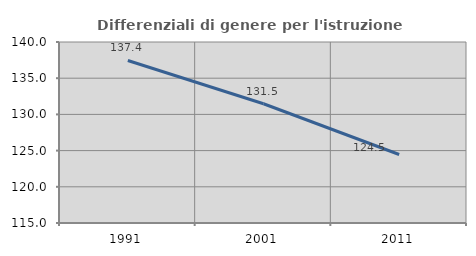
| Category | Differenziali di genere per l'istruzione superiore |
|---|---|
| 1991.0 | 137.446 |
| 2001.0 | 131.472 |
| 2011.0 | 124.458 |